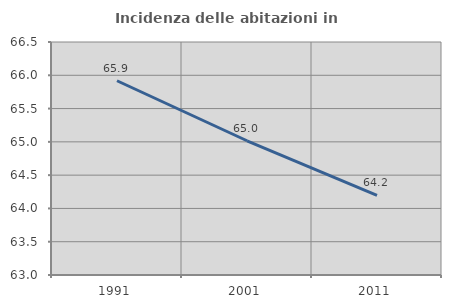
| Category | Incidenza delle abitazioni in proprietà  |
|---|---|
| 1991.0 | 65.918 |
| 2001.0 | 65.017 |
| 2011.0 | 64.194 |